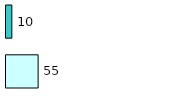
| Category | Series 0 | Series 1 |
|---|---|---|
| 0 | 55 | 10 |